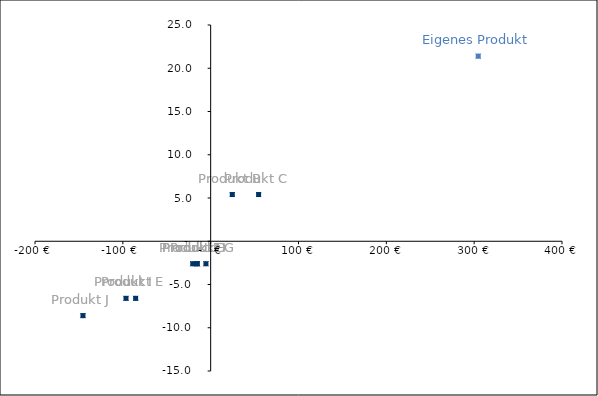
| Category | Series 0 |
|---|---|
| 304.6 | 21.4 |
| 24.599999999999994 | 5.4 |
| 54.599999999999994 | 5.4 |
| -15.400000000000006 | -2.6 |
| -85.4 | -6.6 |
| -20.400000000000006 | -2.6 |
| -5.400000000000006 | -2.6 |
| -15.400000000000006 | -2.6 |
| -96.4 | -6.6 |
| -145.4 | -8.6 |